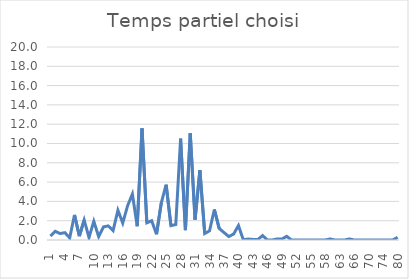
| Category | Temps partiel choisi |
|---|---|
| 1.0 | 0.4 |
| 2.0 | 0.9 |
| 3.0 | 0.67 |
| 4.0 | 0.76 |
| 5.0 | 0.22 |
| 6.0 | 2.6 |
| 7.0 | 0.4 |
| 8.0 | 2.07 |
| 9.0 | 0.26 |
| 10.0 | 1.94 |
| 11.0 | 0.36 |
| 12.0 | 1.36 |
| 13.0 | 1.46 |
| 14.0 | 0.97 |
| 15.0 | 3.08 |
| 16.0 | 1.76 |
| 17.0 | 3.54 |
| 18.0 | 4.76 |
| 19.0 | 1.43 |
| 20.0 | 11.56 |
| 21.0 | 1.79 |
| 22.0 | 1.99 |
| 23.0 | 0.59 |
| 24.0 | 3.85 |
| 25.0 | 5.73 |
| 26.0 | 1.49 |
| 27.0 | 1.61 |
| 28.0 | 10.51 |
| 29.0 | 1.03 |
| 30.0 | 11.05 |
| 31.0 | 2.12 |
| 32.0 | 7.23 |
| 33.0 | 0.68 |
| 34.0 | 0.96 |
| 35.0 | 3.16 |
| 36.0 | 1.2 |
| 37.0 | 0.77 |
| 38.0 | 0.36 |
| 39.0 | 0.62 |
| 40.0 | 1.5 |
| 41.0 | 0.02 |
| 42.0 | 0.1 |
| 43.0 | 0.06 |
| 44.0 | 0.04 |
| 45.0 | 0.46 |
| 46.0 | 0 |
| 47.0 | 0 |
| 48.0 | 0.11 |
| 49.0 | 0.1 |
| 50.0 | 0.38 |
| 51.0 | 0 |
| 52.0 | 0 |
| 53.0 | 0 |
| 54.0 | 0 |
| 55.0 | 0 |
| 56.0 | 0 |
| 57.0 | 0 |
| 58.0 | 0 |
| 60.0 | 0.11 |
| 62.0 | 0 |
| 63.0 | 0 |
| 64.0 | 0 |
| 65.0 | 0.11 |
| 66.0 | 0 |
| 67.0 | 0 |
| 68.0 | 0 |
| 70.0 | 0 |
| 71.0 | 0 |
| 72.0 | 0 |
| 74.0 | 0 |
| 75.0 | 0 |
| 78.0 | 0 |
| 80.0 | 0.28 |